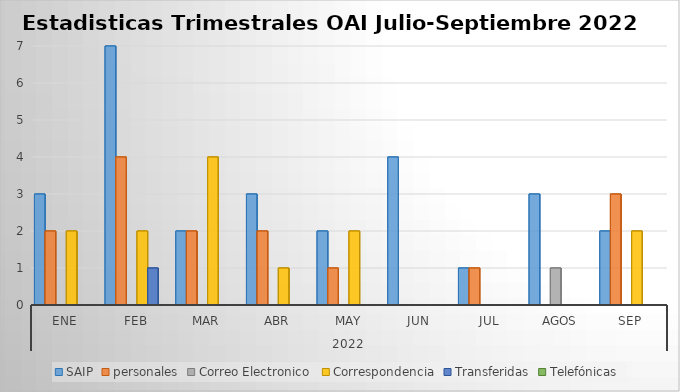
| Category | SAIP | personales | Correo Electronico  | Correspondencia | Transferidas | Telefónicas |
|---|---|---|---|---|---|---|
| 0 | 3 | 2 | 0 | 2 | 0 | 0 |
| 1 | 7 | 4 | 0 | 2 | 1 | 0 |
| 2 | 2 | 2 | 0 | 4 | 0 | 0 |
| 3 | 3 | 2 | 0 | 1 | 0 | 0 |
| 4 | 2 | 1 | 0 | 2 | 0 | 0 |
| 5 | 4 | 0 | 0 | 0 | 0 | 0 |
| 6 | 1 | 1 | 0 | 0 | 0 | 0 |
| 7 | 3 | 0 | 1 | 0 | 0 | 0 |
| 8 | 2 | 3 | 0 | 2 | 0 | 0 |